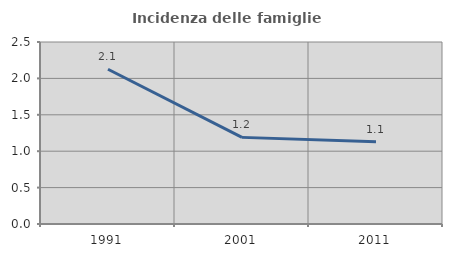
| Category | Incidenza delle famiglie numerose |
|---|---|
| 1991.0 | 2.125 |
| 2001.0 | 1.19 |
| 2011.0 | 1.131 |